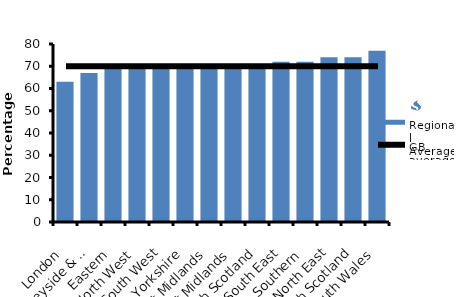
| Category | Regional Average |
|---|---|
| London | 63 |
| Merseyside & North Wales | 67 |
| Eastern | 69 |
| North West | 69 |
| South West | 69 |
| Yorkshire | 69 |
| West Midlands | 70 |
| East Midlands | 71 |
| South Scotland | 71 |
| South East | 72 |
| Southern | 72 |
| North East | 74 |
| North Scotland | 74 |
| South Wales | 77 |